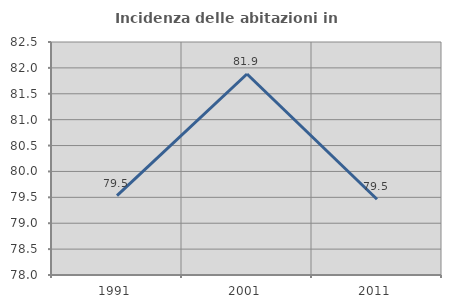
| Category | Incidenza delle abitazioni in proprietà  |
|---|---|
| 1991.0 | 79.532 |
| 2001.0 | 81.882 |
| 2011.0 | 79.462 |